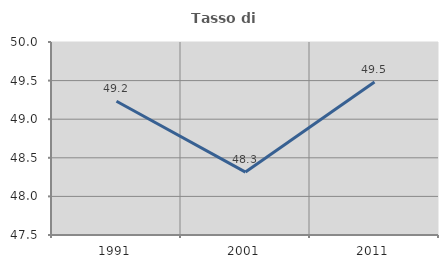
| Category | Tasso di occupazione   |
|---|---|
| 1991.0 | 49.232 |
| 2001.0 | 48.315 |
| 2011.0 | 49.481 |